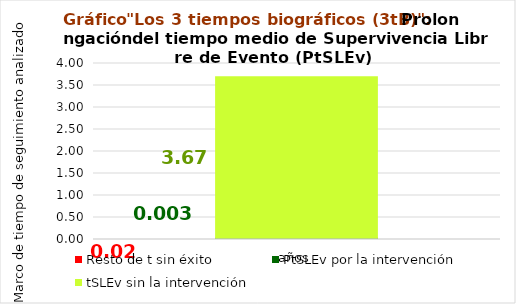
| Category | Resto de t sin éxito | PtSLEv por la intervención | tSLEv sin la intervención |
|---|---|---|---|
| años | 0.023 | 0.003 | 3.674 |